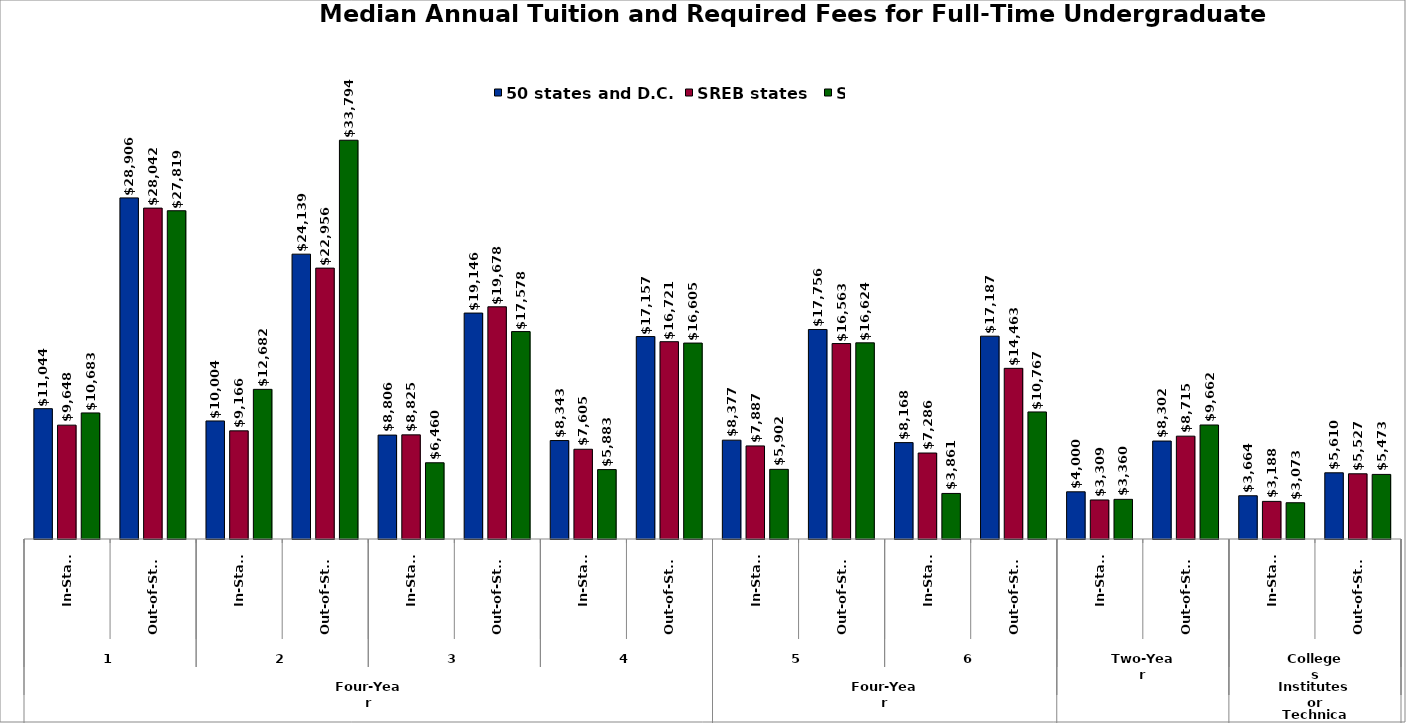
| Category | 50 states and D.C. | SREB states | State |
|---|---|---|---|
| 0 | 11044 | 9648 | 10683 |
| 1 | 28906 | 28041.5 | 27818.5 |
| 2 | 10003.5 | 9165.5 | 12682 |
| 3 | 24139 | 22956 | 33794 |
| 4 | 8806 | 8825 | 6459.5 |
| 5 | 19146 | 19677.5 | 17577.5 |
| 6 | 8343 | 7605 | 5883 |
| 7 | 17157 | 16721 | 16604.5 |
| 8 | 8376.5 | 7887 | 5902 |
| 9 | 17755.5 | 16563 | 16624 |
| 10 | 8168 | 7286 | 3861 |
| 11 | 17187 | 14463 | 10767 |
| 12 | 4000 | 3309 | 3360 |
| 13 | 8302 | 8715 | 9662 |
| 14 | 3664 | 3188 | 3073 |
| 15 | 5610 | 5527 | 5473 |